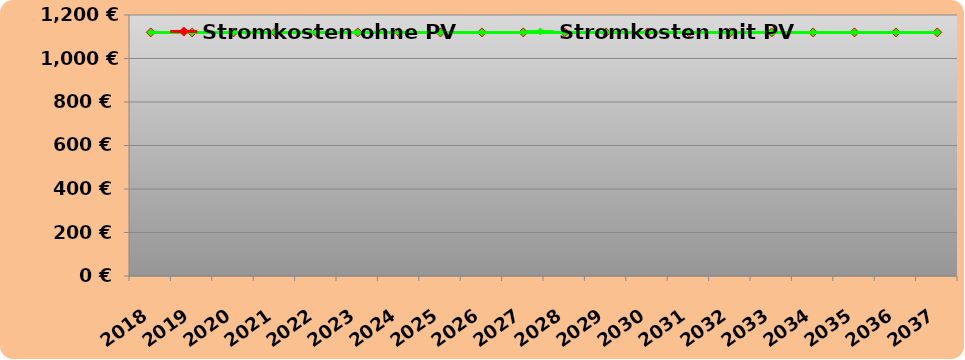
| Category | Stromkosten ohne PV | Stromkosten mit PV |
|---|---|---|
| 2018.0 | 1120 | 1120 |
| 2019.0 | 1120 | 1120 |
| 2020.0 | 1120 | 1120 |
| 2021.0 | 1120 | 1120 |
| 2022.0 | 1120 | 1120 |
| 2023.0 | 1120 | 1120 |
| 2024.0 | 1120 | 1120 |
| 2025.0 | 1120 | 1120 |
| 2026.0 | 1120 | 1120 |
| 2027.0 | 1120 | 1120 |
| 2028.0 | 1120 | 1120 |
| 2029.0 | 1120 | 1120 |
| 2030.0 | 1120 | 1120 |
| 2031.0 | 1120 | 1120 |
| 2032.0 | 1120 | 1120 |
| 2033.0 | 1120 | 1120 |
| 2034.0 | 1120 | 1120 |
| 2035.0 | 1120 | 1120 |
| 2036.0 | 1120 | 1120 |
| 2037.0 | 1120 | 1120 |